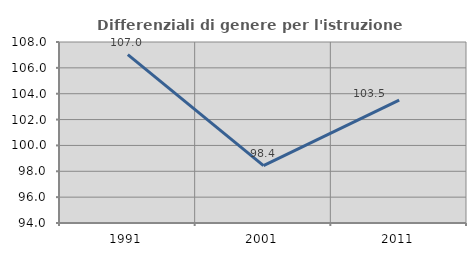
| Category | Differenziali di genere per l'istruzione superiore |
|---|---|
| 1991.0 | 107.027 |
| 2001.0 | 98.443 |
| 2011.0 | 103.497 |